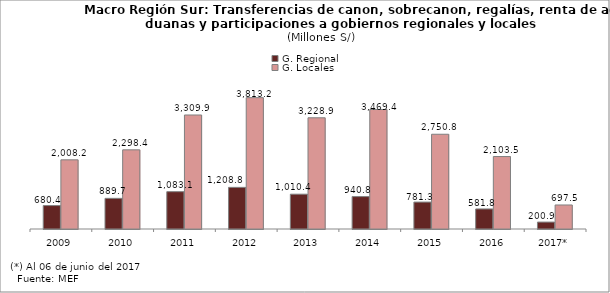
| Category | G. Regional | G. Locales |
|---|---|---|
| 2009 | 680.41 | 2008.165 |
| 2010 | 889.69 | 2298.376 |
| 2011 | 1083.102 | 3309.895 |
| 2012 | 1208.793 | 3813.214 |
| 2013 | 1010.35 | 3228.93 |
| 2014 | 940.781 | 3469.364 |
| 2015 | 781.333 | 2750.781 |
| 2016 | 581.812 | 2103.487 |
| 2017* | 200.943 | 697.478 |